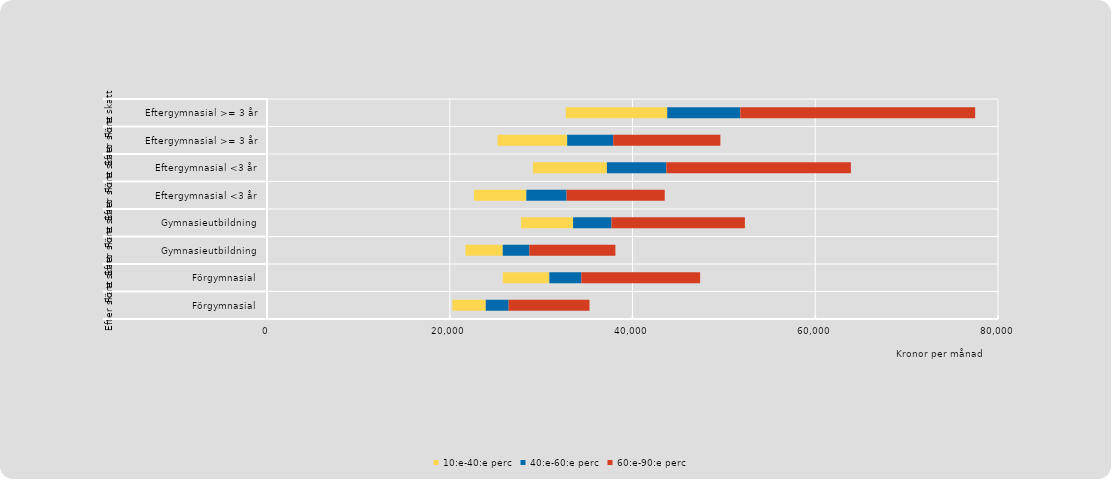
| Category | Series 0 | 10:e-40:e perc | 40:e-60:e perc | 60:e-90:e perc |
|---|---|---|---|---|
| 0 | 20285 | 3653 | 2507 | 8847 |
| 1 | 25800 | 5100 | 3500 | 13000 |
| 2 | 21718 | 4082 | 2919 | 9408 |
| 3 | 27800 | 5700 | 4200 | 14600 |
| 4 | 22649 | 5731 | 4405 | 10742 |
| 5 | 29100 | 8100 | 6500 | 20200 |
| 6 | 25227 | 7625 | 5036 | 11727 |
| 7 | 32700 | 11100 | 8000 | 25700 |